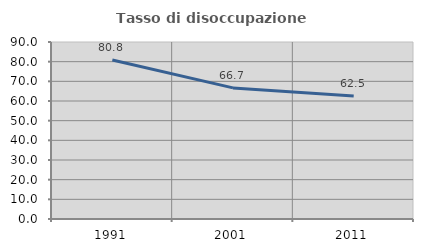
| Category | Tasso di disoccupazione giovanile  |
|---|---|
| 1991.0 | 80.822 |
| 2001.0 | 66.667 |
| 2011.0 | 62.5 |